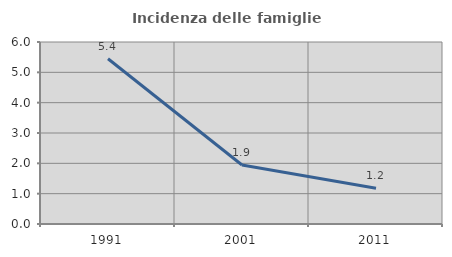
| Category | Incidenza delle famiglie numerose |
|---|---|
| 1991.0 | 5.449 |
| 2001.0 | 1.944 |
| 2011.0 | 1.179 |